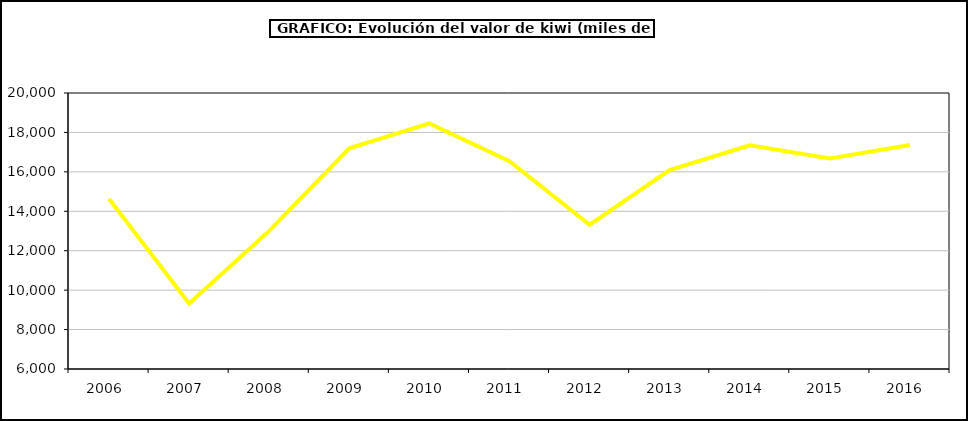
| Category | valor kiwi |
|---|---|
| 2006.0 | 14628.235 |
| 2007.0 | 9325.518 |
| 2008.0 | 13005.729 |
| 2009.0 | 17191.272 |
| 2010.0 | 18455.909 |
| 2011.0 | 16538.05 |
| 2012.0 | 13318.873 |
| 2013.0 | 16091.324 |
| 2014.0 | 17344.225 |
| 2015.0 | 16673 |
| 2016.0 | 17366 |